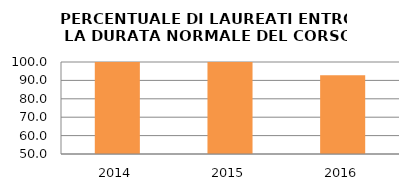
| Category | 2014 2015 2016 |
|---|---|
| 2014.0 | 100 |
| 2015.0 | 100 |
| 2016.0 | 92.857 |